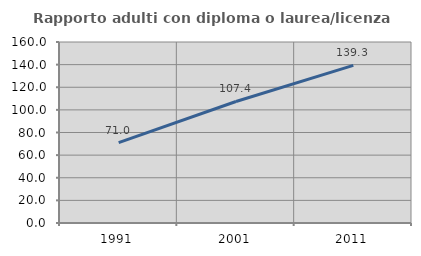
| Category | Rapporto adulti con diploma o laurea/licenza media  |
|---|---|
| 1991.0 | 70.988 |
| 2001.0 | 107.426 |
| 2011.0 | 139.286 |